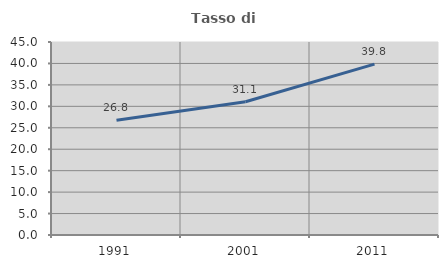
| Category | Tasso di occupazione   |
|---|---|
| 1991.0 | 26.774 |
| 2001.0 | 31.077 |
| 2011.0 | 39.835 |